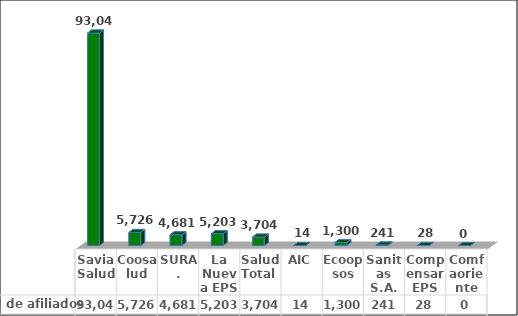
| Category | N° de afiliados | % |
|---|---|---|
| Savia Salud | 93046 | 81.66 |
| Coosalud | 5726 | 5.025 |
| SURA. | 4681 | 4.108 |
| La Nueva EPS | 5203 | 4.566 |
| Salud Total  | 3704 | 3.251 |
| AIC | 14 | 0.012 |
| Ecoopsos | 1300 | 1.141 |
| Sanitas S.A. | 241 | 0.212 |
| Compensar EPS | 28 | 0.025 |
| Comfaoriente | 0 | 0 |